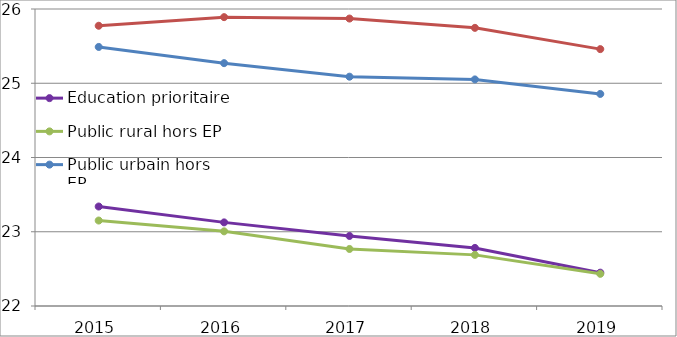
| Category | Éducation prioritaire | Public rural hors EP | Public urbain hors EP | Privé sous contrat |
|---|---|---|---|---|
| 2015.0 | 23.34 | 23.151 | 25.489 | 25.774 |
| 2016.0 | 23.126 | 23.005 | 25.271 | 25.89 |
| 2017.0 | 22.943 | 22.768 | 25.088 | 25.871 |
| 2018.0 | 22.782 | 22.689 | 25.051 | 25.746 |
| 2019.0 | 22.449 | 22.433 | 24.856 | 25.46 |